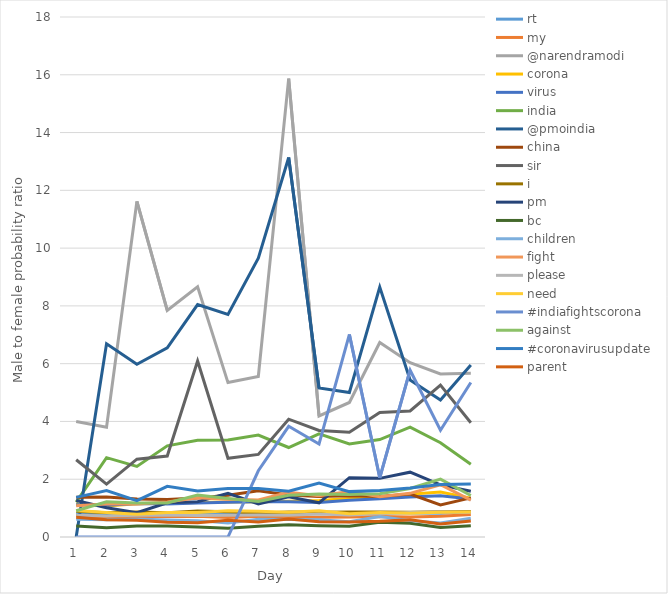
| Category | rt | my | @narendramodi | corona | virus | india | @pmoindia | china | sir | i | pm | bc | children | fight | please | need | #indiafightscorona | against | #coronavirusupdate | parent |
|---|---|---|---|---|---|---|---|---|---|---|---|---|---|---|---|---|---|---|---|---|
| 0 | 0.803 | 0.742 | 4 | 1.14 | 1.118 | 1.205 | 0 | 1.38 | 2.675 | 0.893 | 1.262 | 0.382 | 0.614 | 1.08 | 0.752 | 0.918 | 0 | 0.908 | 1.372 | 0.68 |
| 1 | 0.811 | 0.675 | 3.799 | 1.075 | 1.097 | 2.747 | 6.689 | 1.387 | 1.829 | 0.841 | 1.014 | 0.323 | 0.6 | 1.145 | 0.724 | 0.846 | 0 | 1.218 | 1.609 | 0.595 |
| 2 | 0.836 | 0.721 | 11.615 | 1.154 | 1.159 | 2.444 | 5.981 | 1.317 | 2.693 | 0.866 | 0.839 | 0.38 | 0.624 | 1.139 | 0.752 | 0.79 | 0 | 1.176 | 1.26 | 0.58 |
| 3 | 0.822 | 0.711 | 7.844 | 1.165 | 1.142 | 3.156 | 6.548 | 1.302 | 2.802 | 0.836 | 1.186 | 0.384 | 0.585 | 1.214 | 0.764 | 0.851 | 0 | 1.178 | 1.753 | 0.514 |
| 4 | 0.822 | 0.719 | 8.66 | 1.198 | 1.175 | 3.35 | 8.045 | 1.348 | 6.094 | 0.903 | 1.221 | 0.347 | 0.567 | 1.357 | 0.742 | 0.848 | 0 | 1.454 | 1.592 | 0.49 |
| 5 | 0.813 | 0.675 | 5.345 | 1.215 | 1.203 | 3.355 | 7.704 | 1.447 | 2.724 | 0.87 | 1.512 | 0.299 | 0.487 | 1.309 | 0.756 | 0.91 | 0 | 1.336 | 1.676 | 0.582 |
| 6 | 0.834 | 0.716 | 5.558 | 1.222 | 1.223 | 3.527 | 9.649 | 1.602 | 2.857 | 0.826 | 1.144 | 0.372 | 0.611 | 1.28 | 0.757 | 0.891 | 2.293 | 1.226 | 1.676 | 0.519 |
| 7 | 0.839 | 0.694 | 15.865 | 1.234 | 1.22 | 3.098 | 13.137 | 1.458 | 4.079 | 0.865 | 1.389 | 0.421 | 0.605 | 1.549 | 0.751 | 0.859 | 3.832 | 1.442 | 1.588 | 0.622 |
| 8 | 0.842 | 0.681 | 4.19 | 1.267 | 1.192 | 3.571 | 5.162 | 1.402 | 3.69 | 0.858 | 1.182 | 0.39 | 0.596 | 1.431 | 0.794 | 0.905 | 3.221 | 1.488 | 1.87 | 0.526 |
| 9 | 0.844 | 0.691 | 4.657 | 1.331 | 1.27 | 3.222 | 5.001 | 1.429 | 3.629 | 0.861 | 2.053 | 0.37 | 0.53 | 1.573 | 0.762 | 0.801 | 7.011 | 1.474 | 1.571 | 0.516 |
| 10 | 0.841 | 0.712 | 6.732 | 1.389 | 1.328 | 3.374 | 8.65 | 1.406 | 4.308 | 0.87 | 2.03 | 0.506 | 0.706 | 1.392 | 0.802 | 0.844 | 2.049 | 1.495 | 1.606 | 0.542 |
| 11 | 0.828 | 0.694 | 6.036 | 1.481 | 1.381 | 3.8 | 5.434 | 1.486 | 4.361 | 0.853 | 2.245 | 0.473 | 0.567 | 1.512 | 0.849 | 0.82 | 5.774 | 1.681 | 1.694 | 0.593 |
| 12 | 0.822 | 0.715 | 5.643 | 1.56 | 1.43 | 3.261 | 4.74 | 1.108 | 5.259 | 0.872 | 1.805 | 0.326 | 0.487 | 1.81 | 0.869 | 0.853 | 3.697 | 2.006 | 1.82 | 0.451 |
| 13 | 0.87 | 0.778 | 5.665 | 1.346 | 1.314 | 2.518 | 5.952 | 1.353 | 3.956 | 0.879 | 1.582 | 0.389 | 0.646 | 1.274 | 0.861 | 0.861 | 5.346 | 1.438 | 1.83 | 0.551 |